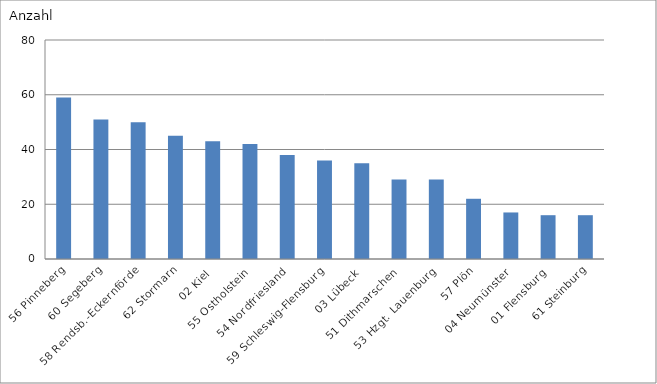
| Category | 56 Pinneberg |
|---|---|
| 56 Pinneberg | 59 |
| 60 Segeberg | 51 |
| 58 Rendsb.-Eckernförde | 50 |
| 62 Stormarn | 45 |
| 02 Kiel | 43 |
| 55 Ostholstein | 42 |
| 54 Nordfriesland | 38 |
| 59 Schleswig-Flensburg | 36 |
| 03 Lübeck | 35 |
| 51 Dithmarschen | 29 |
| 53 Hzgt. Lauenburg | 29 |
| 57 Plön | 22 |
| 04 Neumünster | 17 |
| 01 Flensburg | 16 |
| 61 Steinburg | 16 |